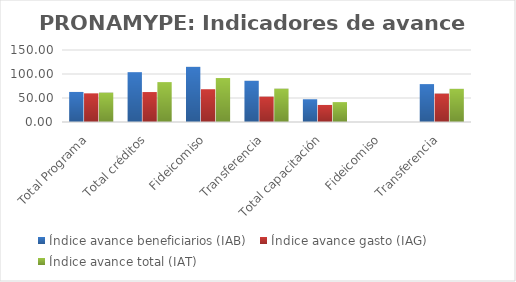
| Category | Índice avance beneficiarios (IAB)  | Índice avance gasto (IAG) | Índice avance total (IAT)  |
|---|---|---|---|
| Total Programa | 62.622 | 59.701 | 61.161 |
| Total créditos | 103.8 | 62.418 | 83.109 |
| Fideicomiso | 114.887 | 68.278 | 91.583 |
| Transferencia | 85.864 | 52.937 | 69.4 |
| Total capacitación | 47.37 | 35.52 | 41.445 |
| Fideicomiso | 0 | 0 | 0 |
| Transferencia | 78.951 | 59.199 | 69.075 |